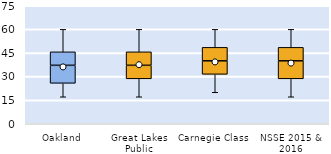
| Category | 25th | 50th | 75th |
|---|---|---|---|
| Oakland | 25.714 | 11.429 | 8.571 |
| Great Lakes Public | 28.571 | 8.571 | 8.571 |
| Carnegie Class | 31.429 | 8.571 | 8.571 |
| NSSE 2015 & 2016 | 28.571 | 11.429 | 8.571 |